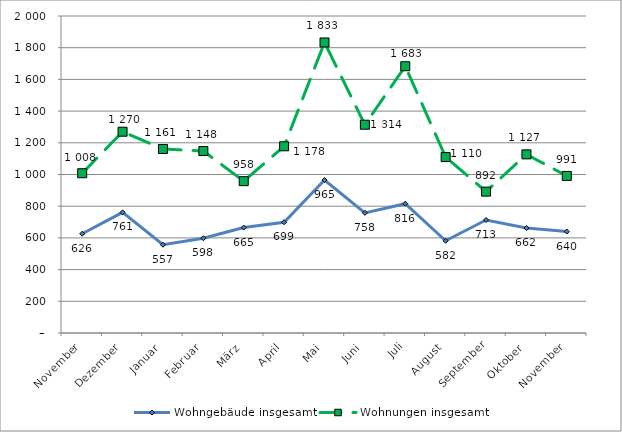
| Category | Wohngebäude insgesamt | Wohnungen insgesamt |
|---|---|---|
| November | 626 | 1008 |
| Dezember | 761 | 1270 |
| Januar | 557 | 1161 |
| Februar | 598 | 1148 |
| März | 665 | 958 |
| April | 699 | 1178 |
| Mai | 965 | 1833 |
| Juni | 758 | 1314 |
| Juli | 816 | 1683 |
| August | 582 | 1110 |
| September | 713 | 892 |
| Oktober | 662 | 1127 |
| November | 640 | 991 |